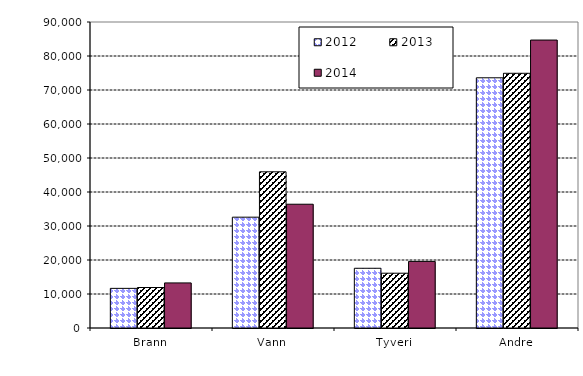
| Category | 2012 | 2013 | 2014 |
|---|---|---|---|
| Brann | 11658 | 11909 | 13260 |
| Vann | 32596 | 45935 | 36404 |
| Tyveri | 17567 | 16113 | 19583 |
| Andre | 73593 | 74914 | 84689 |